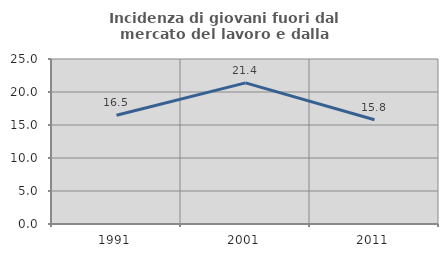
| Category | Incidenza di giovani fuori dal mercato del lavoro e dalla formazione  |
|---|---|
| 1991.0 | 16.484 |
| 2001.0 | 21.384 |
| 2011.0 | 15.789 |